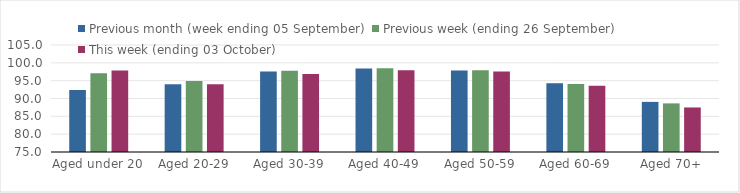
| Category | Previous month (week ending 05 September) | Previous week (ending 26 September) | This week (ending 03 October) |
|---|---|---|---|
| Aged under 20 | 92.38 | 97.1 | 97.86 |
| Aged 20-29 | 93.97 | 94.88 | 93.99 |
| Aged 30-39 | 97.57 | 97.75 | 96.9 |
| Aged 40-49 | 98.44 | 98.51 | 97.91 |
| Aged 50-59 | 97.87 | 97.89 | 97.57 |
| Aged 60-69 | 94.28 | 94.04 | 93.59 |
| Aged 70+ | 89.05 | 88.63 | 87.49 |